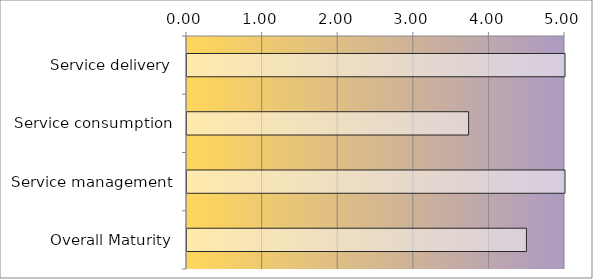
| Category | Series 0 |
|---|---|
| Service delivery | 5 |
| Service consumption | 3.725 |
| Service management | 5 |
| Overall Maturity | 4.49 |